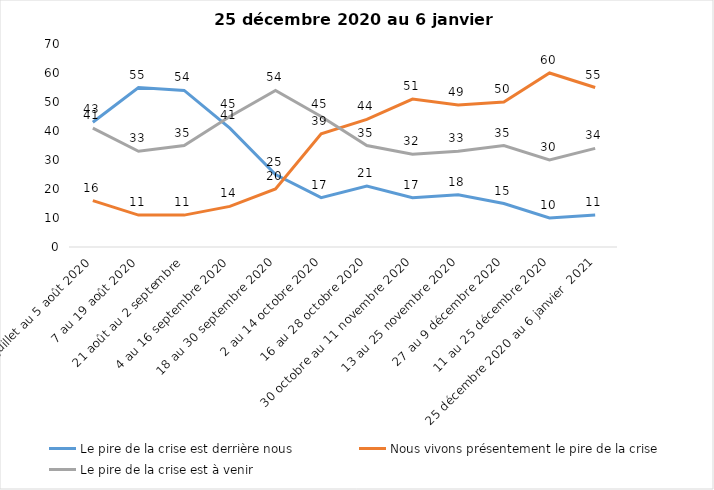
| Category | Le pire de la crise est derrière nous | Nous vivons présentement le pire de la crise | Le pire de la crise est à venir |
|---|---|---|---|
| 24 juillet au 5 août 2020 | 43 | 16 | 41 |
| 7 au 19 août 2020 | 55 | 11 | 33 |
| 21 août au 2 septembre | 54 | 11 | 35 |
| 4 au 16 septembre 2020 | 41 | 14 | 45 |
| 18 au 30 septembre 2020 | 25 | 20 | 54 |
| 2 au 14 octobre 2020 | 17 | 39 | 45 |
| 16 au 28 octobre 2020 | 21 | 44 | 35 |
| 30 octobre au 11 novembre 2020 | 17 | 51 | 32 |
| 13 au 25 novembre 2020 | 18 | 49 | 33 |
| 27 au 9 décembre 2020 | 15 | 50 | 35 |
| 11 au 25 décembre 2020 | 10 | 60 | 30 |
| 25 décembre 2020 au 6 janvier  2021 | 11 | 55 | 34 |